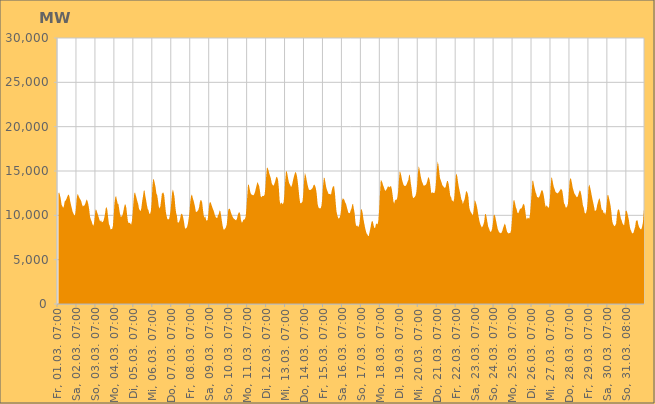
| Category | Series 0 |
|---|---|
|  Fr, 01.03. 07:00  | 12474 |
|  Fr, 01.03. 08:00  | 12588 |
|  Fr, 01.03. 09:00  | 12278 |
|  Fr, 01.03. 10:00  | 11848 |
|  Fr, 01.03. 11:00  | 11210 |
|  Fr, 01.03. 12:00  | 11018 |
|  Fr, 01.03. 13:00  | 10865 |
|  Fr, 01.03. 14:00  | 11047 |
|  Fr, 01.03. 15:00  | 11590 |
|  Fr, 01.03. 16:00  | 11647 |
|  Fr, 01.03. 17:00  | 11807 |
|  Fr, 01.03. 18:00  | 12052 |
|  Fr, 01.03. 19:00  | 12258 |
|  Fr, 01.03. 20:00  | 12343 |
|  Fr, 01.03. 21:00  | 12111 |
|  Fr, 01.03. 22:00  | 11577 |
|  Fr, 01.03. 23:00  | 11164 |
|  Sa, 02.03. 00:00  | 10797 |
|  Sa, 02.03. 01:00  | 10409 |
|  Sa, 02.03. 02:00  | 10225 |
|  Sa, 02.03. 03:00  | 10004 |
|  Sa, 02.03. 04:00  | 10010 |
|  Sa, 02.03. 05:00  | 10599 |
|  Sa, 02.03. 06:00  | 11720 |
|  Sa, 02.03. 07:00  | 12374 |
|  Sa, 02.03. 08:00  | 12331 |
|  Sa, 02.03. 09:00  | 12085 |
|  Sa, 02.03. 10:00  | 11909 |
|  Sa, 02.03. 11:00  | 11770 |
|  Sa, 02.03. 12:00  | 11555 |
|  Sa, 02.03. 13:00  | 11205 |
|  Sa, 02.03. 14:00  | 11000 |
|  Sa, 02.03. 15:00  | 11093 |
|  Sa, 02.03. 16:00  | 11101 |
|  Sa, 02.03. 17:00  | 11313 |
|  Sa, 02.03. 18:00  | 11615 |
|  Sa, 02.03. 19:00  | 11793 |
|  Sa, 02.03. 20:00  | 11565 |
|  Sa, 02.03. 21:00  | 11215 |
|  Sa, 02.03. 22:00  | 10663 |
|  Sa, 02.03. 23:00  | 9869 |
|  So, 03.03. 00:00  | 9539 |
|  So, 03.03. 01:00  | 9340 |
|  So, 03.03. 02:00  | 9037 |
|  So, 03.03. 03:00  | 8820 |
|  So, 03.03. 04:00  | 9035 |
|  So, 03.03. 05:00  | 9807 |
|  So, 03.03. 06:00  | 10649 |
|  So, 03.03. 07:00  | 10633 |
|  So, 03.03. 08:00  | 10366 |
|  So, 03.03. 09:00  | 10088 |
|  So, 03.03. 10:00  | 9784 |
|  So, 03.03. 11:00  | 9491 |
|  So, 03.03. 12:00  | 9295 |
|  So, 03.03. 13:00  | 9470 |
|  So, 03.03. 14:00  | 9209 |
|  So, 03.03. 15:00  | 9255 |
|  So, 03.03. 16:00  | 9367 |
|  So, 03.03. 17:00  | 9700 |
|  So, 03.03. 18:00  | 10154 |
|  So, 03.03. 19:00  | 10827 |
|  So, 03.03. 20:00  | 10927 |
|  So, 03.03. 21:00  | 10557 |
|  So, 03.03. 22:00  | 9726 |
|  So, 03.03. 23:00  | 8995 |
|  Mo, 04.03. 00:00  | 8818 |
|  Mo, 04.03. 01:00  | 8394 |
|  Mo, 04.03. 02:00  | 8450 |
|  Mo, 04.03. 03:00  | 8442 |
|  Mo, 04.03. 04:00  | 8826 |
|  Mo, 04.03. 05:00  | 9967 |
|  Mo, 04.03. 06:00  | 11379 |
|  Mo, 04.03. 07:00  | 12036 |
|  Mo, 04.03. 08:00  | 12201 |
|  Mo, 04.03. 09:00  | 11750 |
|  Mo, 04.03. 10:00  | 11328 |
|  Mo, 04.03. 11:00  | 11286 |
|  Mo, 04.03. 12:00  | 10682 |
|  Mo, 04.03. 13:00  | 10157 |
|  Mo, 04.03. 14:00  | 9817 |
|  Mo, 04.03. 15:00  | 9871 |
|  Mo, 04.03. 16:00  | 10009 |
|  Mo, 04.03. 17:00  | 10329 |
|  Mo, 04.03. 18:00  | 10817 |
|  Mo, 04.03. 19:00  | 11216 |
|  Mo, 04.03. 20:00  | 11229 |
|  Mo, 04.03. 21:00  | 10851 |
|  Mo, 04.03. 22:00  | 10041 |
|  Mo, 04.03. 23:00  | 9333 |
|  Di, 05.03. 00:00  | 9113 |
|  Di, 05.03. 01:00  | 9171 |
|  Di, 05.03. 02:00  | 9086 |
|  Di, 05.03. 03:00  | 8950 |
|  Di, 05.03. 04:00  | 9324 |
|  Di, 05.03. 05:00  | 10241 |
|  Di, 05.03. 06:00  | 11439 |
|  Di, 05.03. 07:00  | 12460 |
|  Di, 05.03. 08:00  | 12591 |
|  Di, 05.03. 09:00  | 12242 |
|  Di, 05.03. 10:00  | 11918 |
|  Di, 05.03. 11:00  | 11565 |
|  Di, 05.03. 12:00  | 11300 |
|  Di, 05.03. 13:00  | 10754 |
|  Di, 05.03. 14:00  | 10591 |
|  Di, 05.03. 15:00  | 10469 |
|  Di, 05.03. 16:00  | 10821 |
|  Di, 05.03. 17:00  | 11552 |
|  Di, 05.03. 18:00  | 12109 |
|  Di, 05.03. 19:00  | 12754 |
|  Di, 05.03. 20:00  | 12836 |
|  Di, 05.03. 21:00  | 12213 |
|  Di, 05.03. 22:00  | 11735 |
|  Di, 05.03. 23:00  | 11202 |
|  Mi, 06.03. 00:00  | 10736 |
|  Mi, 06.03. 01:00  | 10596 |
|  Mi, 06.03. 02:00  | 10188 |
|  Mi, 06.03. 03:00  | 10158 |
|  Mi, 06.03. 04:00  | 10442 |
|  Mi, 06.03. 05:00  | 11448 |
|  Mi, 06.03. 06:00  | 13250 |
|  Mi, 06.03. 07:00  | 14131 |
|  Mi, 06.03. 08:00  | 14007 |
|  Mi, 06.03. 09:00  | 13616 |
|  Mi, 06.03. 10:00  | 13184 |
|  Mi, 06.03. 11:00  | 12484 |
|  Mi, 06.03. 12:00  | 12289 |
|  Mi, 06.03. 13:00  | 11728 |
|  Mi, 06.03. 14:00  | 11034 |
|  Mi, 06.03. 15:00  | 10759 |
|  Mi, 06.03. 16:00  | 11009 |
|  Mi, 06.03. 17:00  | 11661 |
|  Mi, 06.03. 18:00  | 12433 |
|  Mi, 06.03. 19:00  | 12543 |
|  Mi, 06.03. 20:00  | 12572 |
|  Mi, 06.03. 21:00  | 12222 |
|  Mi, 06.03. 22:00  | 11279 |
|  Mi, 06.03. 23:00  | 10389 |
|  Do, 07.03. 00:00  | 9917 |
|  Do, 07.03. 01:00  | 9564 |
|  Do, 07.03. 02:00  | 9549 |
|  Do, 07.03. 03:00  | 9561 |
|  Do, 07.03. 04:00  | 9956 |
|  Do, 07.03. 05:00  | 10587 |
|  Do, 07.03. 06:00  | 11574 |
|  Do, 07.03. 07:00  | 12618 |
|  Do, 07.03. 08:00  | 12909 |
|  Do, 07.03. 09:00  | 12537 |
|  Do, 07.03. 10:00  | 12048 |
|  Do, 07.03. 11:00  | 10982 |
|  Do, 07.03. 12:00  | 10286 |
|  Do, 07.03. 13:00  | 9961 |
|  Do, 07.03. 14:00  | 9202 |
|  Do, 07.03. 15:00  | 9158 |
|  Do, 07.03. 16:00  | 9317 |
|  Do, 07.03. 17:00  | 9592 |
|  Do, 07.03. 18:00  | 10062 |
|  Do, 07.03. 19:00  | 10199 |
|  Do, 07.03. 20:00  | 10077 |
|  Do, 07.03. 21:00  | 9756 |
|  Do, 07.03. 22:00  | 9264 |
|  Do, 07.03. 23:00  | 8646 |
|  Fr, 08.03. 00:00  | 8466 |
|  Fr, 08.03. 01:00  | 8565 |
|  Fr, 08.03. 02:00  | 8714 |
|  Fr, 08.03. 03:00  | 9104 |
|  Fr, 08.03. 04:00  | 9696 |
|  Fr, 08.03. 05:00  | 10491 |
|  Fr, 08.03. 06:00  | 11575 |
|  Fr, 08.03. 07:00  | 12190 |
|  Fr, 08.03. 08:00  | 12358 |
|  Fr, 08.03. 09:00  | 11987 |
|  Fr, 08.03. 10:00  | 11693 |
|  Fr, 08.03. 11:00  | 11343 |
|  Fr, 08.03. 12:00  | 10907 |
|  Fr, 08.03. 13:00  | 10402 |
|  Fr, 08.03. 14:00  | 10389 |
|  Fr, 08.03. 15:00  | 10480 |
|  Fr, 08.03. 16:00  | 10586 |
|  Fr, 08.03. 17:00  | 10871 |
|  Fr, 08.03. 18:00  | 11435 |
|  Fr, 08.03. 19:00  | 11743 |
|  Fr, 08.03. 20:00  | 11698 |
|  Fr, 08.03. 21:00  | 11434 |
|  Fr, 08.03. 22:00  | 10619 |
|  Fr, 08.03. 23:00  | 9959 |
|  Sa, 09.03. 00:00  | 9734 |
|  Sa, 09.03. 01:00  | 9863 |
|  Sa, 09.03. 02:00  | 9474 |
|  Sa, 09.03. 03:00  | 9385 |
|  Sa, 09.03. 04:00  | 9526 |
|  Sa, 09.03. 05:00  | 10332 |
|  Sa, 09.03. 06:00  | 11295 |
|  Sa, 09.03. 07:00  | 11522 |
|  Sa, 09.03. 08:00  | 11406 |
|  Sa, 09.03. 09:00  | 11113 |
|  Sa, 09.03. 10:00  | 10850 |
|  Sa, 09.03. 11:00  | 10638 |
|  Sa, 09.03. 12:00  | 10383 |
|  Sa, 09.03. 13:00  | 10045 |
|  Sa, 09.03. 14:00  | 9830 |
|  Sa, 09.03. 15:00  | 9734 |
|  Sa, 09.03. 16:00  | 9692 |
|  Sa, 09.03. 17:00  | 10002 |
|  Sa, 09.03. 18:00  | 10145 |
|  Sa, 09.03. 19:00  | 10536 |
|  Sa, 09.03. 20:00  | 10481 |
|  Sa, 09.03. 21:00  | 9923 |
|  Sa, 09.03. 22:00  | 9314 |
|  Sa, 09.03. 23:00  | 8771 |
|  So, 10.03. 00:00  | 8410 |
|  So, 10.03. 01:00  | 8400 |
|  So, 10.03. 02:00  | 8503 |
|  So, 10.03. 03:00  | 8642 |
|  So, 10.03. 04:00  | 8931 |
|  So, 10.03. 05:00  | 9654 |
|  So, 10.03. 06:00  | 10614 |
|  So, 10.03. 07:00  | 10736 |
|  So, 10.03. 08:00  | 10727 |
|  So, 10.03. 09:00  | 10445 |
|  So, 10.03. 10:00  | 10164 |
|  So, 10.03. 11:00  | 9933 |
|  So, 10.03. 12:00  | 9764 |
|  So, 10.03. 13:00  | 9615 |
|  So, 10.03. 14:00  | 9565 |
|  So, 10.03. 15:00  | 9465 |
|  So, 10.03. 16:00  | 9455 |
|  So, 10.03. 17:00  | 9610 |
|  So, 10.03. 18:00  | 10009 |
|  So, 10.03. 19:00  | 10285 |
|  So, 10.03. 20:00  | 10373 |
|  So, 10.03. 21:00  | 10180 |
|  So, 10.03. 22:00  | 9527 |
|  So, 10.03. 23:00  | 9192 |
|  Mo, 11.03. 00:00  | 9229 |
|  Mo, 11.03. 01:00  | 9491 |
|  Mo, 11.03. 02:00  | 9509 |
|  Mo, 11.03. 03:00  | 9581 |
|  Mo, 11.03. 04:00  | 9849 |
|  Mo, 11.03. 05:00  | 10795 |
|  Mo, 11.03. 06:00  | 12080 |
|  Mo, 11.03. 07:00  | 13445 |
|  Mo, 11.03. 08:00  | 13476 |
|  Mo, 11.03. 09:00  | 13023 |
|  Mo, 11.03. 10:00  | 12595 |
|  Mo, 11.03. 11:00  | 12364 |
|  Mo, 11.03. 12:00  | 12342 |
|  Mo, 11.03. 13:00  | 12275 |
|  Mo, 11.03. 14:00  | 12276 |
|  Mo, 11.03. 15:00  | 12404 |
|  Mo, 11.03. 16:00  | 12668 |
|  Mo, 11.03. 17:00  | 13078 |
|  Mo, 11.03. 18:00  | 13417 |
|  Mo, 11.03. 19:00  | 13770 |
|  Mo, 11.03. 20:00  | 13541 |
|  Mo, 11.03. 21:00  | 13348 |
|  Mo, 11.03. 22:00  | 12824 |
|  Mo, 11.03. 23:00  | 12159 |
|  Di, 12.03. 00:00  | 12028 |
|  Di, 12.03. 01:00  | 12175 |
|  Di, 12.03. 02:00  | 12201 |
|  Di, 12.03. 03:00  | 12161 |
|  Di, 12.03. 04:00  | 12347 |
|  Di, 12.03. 05:00  | 13119 |
|  Di, 12.03. 06:00  | 14390 |
|  Di, 12.03. 07:00  | 15411 |
|  Di, 12.03. 08:00  | 15333 |
|  Di, 12.03. 09:00  | 15072 |
|  Di, 12.03. 10:00  | 14700 |
|  Di, 12.03. 11:00  | 14423 |
|  Di, 12.03. 12:00  | 14127 |
|  Di, 12.03. 13:00  | 13640 |
|  Di, 12.03. 14:00  | 13441 |
|  Di, 12.03. 15:00  | 13336 |
|  Di, 12.03. 16:00  | 13452 |
|  Di, 12.03. 17:00  | 13712 |
|  Di, 12.03. 18:00  | 14057 |
|  Di, 12.03. 19:00  | 14358 |
|  Di, 12.03. 20:00  | 14291 |
|  Di, 12.03. 21:00  | 14018 |
|  Di, 12.03. 22:00  | 13127 |
|  Di, 12.03. 23:00  | 11710 |
|  Mi, 13.03. 00:00  | 11225 |
|  Mi, 13.03. 01:00  | 11451 |
|  Mi, 13.03. 02:00  | 11354 |
|  Mi, 13.03. 03:00  | 11244 |
|  Mi, 13.03. 04:00  | 11422 |
|  Mi, 13.03. 05:00  | 12276 |
|  Mi, 13.03. 06:00  | 13773 |
|  Mi, 13.03. 07:00  | 14905 |
|  Mi, 13.03. 08:00  | 14998 |
|  Mi, 13.03. 09:00  | 14563 |
|  Mi, 13.03. 10:00  | 14048 |
|  Mi, 13.03. 11:00  | 13669 |
|  Mi, 13.03. 12:00  | 13487 |
|  Mi, 13.03. 13:00  | 13277 |
|  Mi, 13.03. 14:00  | 13211 |
|  Mi, 13.03. 15:00  | 13529 |
|  Mi, 13.03. 16:00  | 13969 |
|  Mi, 13.03. 17:00  | 14341 |
|  Mi, 13.03. 18:00  | 14658 |
|  Mi, 13.03. 19:00  | 14904 |
|  Mi, 13.03. 20:00  | 14765 |
|  Mi, 13.03. 21:00  | 14402 |
|  Mi, 13.03. 22:00  | 13797 |
|  Mi, 13.03. 23:00  | 12966 |
|  Do, 14.03. 00:00  | 12030 |
|  Do, 14.03. 01:00  | 11409 |
|  Do, 14.03. 02:00  | 11354 |
|  Do, 14.03. 03:00  | 11444 |
|  Do, 14.03. 04:00  | 11561 |
|  Do, 14.03. 05:00  | 12450 |
|  Do, 14.03. 06:00  | 13891 |
|  Do, 14.03. 07:00  | 14772 |
|  Do, 14.03. 08:00  | 14549 |
|  Do, 14.03. 09:00  | 14091 |
|  Do, 14.03. 10:00  | 13630 |
|  Do, 14.03. 11:00  | 13211 |
|  Do, 14.03. 12:00  | 12918 |
|  Do, 14.03. 13:00  | 12856 |
|  Do, 14.03. 14:00  | 12856 |
|  Do, 14.03. 15:00  | 12921 |
|  Do, 14.03. 16:00  | 13010 |
|  Do, 14.03. 17:00  | 13123 |
|  Do, 14.03. 18:00  | 13410 |
|  Do, 14.03. 19:00  | 13473 |
|  Do, 14.03. 20:00  | 13309 |
|  Do, 14.03. 21:00  | 13008 |
|  Do, 14.03. 22:00  | 12407 |
|  Do, 14.03. 23:00  | 11364 |
|  Fr, 15.03. 00:00  | 10946 |
|  Fr, 15.03. 01:00  | 10788 |
|  Fr, 15.03. 02:00  | 10801 |
|  Fr, 15.03. 03:00  | 10784 |
|  Fr, 15.03. 04:00  | 11090 |
|  Fr, 15.03. 05:00  | 11916 |
|  Fr, 15.03. 06:00  | 13313 |
|  Fr, 15.03. 07:00  | 14249 |
|  Fr, 15.03. 08:00  | 14199 |
|  Fr, 15.03. 09:00  | 13708 |
|  Fr, 15.03. 10:00  | 13168 |
|  Fr, 15.03. 11:00  | 12864 |
|  Fr, 15.03. 12:00  | 12638 |
|  Fr, 15.03. 13:00  | 12417 |
|  Fr, 15.03. 14:00  | 12402 |
|  Fr, 15.03. 15:00  | 12424 |
|  Fr, 15.03. 16:00  | 12304 |
|  Fr, 15.03. 17:00  | 12790 |
|  Fr, 15.03. 18:00  | 13159 |
|  Fr, 15.03. 19:00  | 13296 |
|  Fr, 15.03. 20:00  | 13253 |
|  Fr, 15.03. 21:00  | 12543 |
|  Fr, 15.03. 22:00  | 11426 |
|  Fr, 15.03. 23:00  | 10445 |
|  Sa, 16.03. 00:00  | 10012 |
|  Sa, 16.03. 01:00  | 9732 |
|  Sa, 16.03. 02:00  | 9620 |
|  Sa, 16.03. 03:00  | 9746 |
|  Sa, 16.03. 04:00  | 10057 |
|  Sa, 16.03. 05:00  | 10756 |
|  Sa, 16.03. 06:00  | 11691 |
|  Sa, 16.03. 07:00  | 11928 |
|  Sa, 16.03. 08:00  | 11859 |
|  Sa, 16.03. 09:00  | 11732 |
|  Sa, 16.03. 10:00  | 11453 |
|  Sa, 16.03. 11:00  | 11303 |
|  Sa, 16.03. 12:00  | 10972 |
|  Sa, 16.03. 13:00  | 10632 |
|  Sa, 16.03. 14:00  | 10286 |
|  Sa, 16.03. 15:00  | 10268 |
|  Sa, 16.03. 16:00  | 10246 |
|  Sa, 16.03. 17:00  | 10591 |
|  Sa, 16.03. 18:00  | 10771 |
|  Sa, 16.03. 19:00  | 11243 |
|  Sa, 16.03. 20:00  | 11273 |
|  Sa, 16.03. 21:00  | 10724 |
|  Sa, 16.03. 22:00  | 10223 |
|  Sa, 16.03. 23:00  | 9214 |
|  So, 17.03. 00:00  | 8775 |
|  So, 17.03. 01:00  | 8880 |
|  So, 17.03. 02:00  | 8748 |
|  So, 17.03. 03:00  | 8711 |
|  So, 17.03. 04:00  | 9031 |
|  So, 17.03. 05:00  | 9813 |
|  So, 17.03. 06:00  | 10713 |
|  So, 17.03. 07:00  | 10661 |
|  So, 17.03. 08:00  | 10326 |
|  So, 17.03. 09:00  | 9661 |
|  So, 17.03. 10:00  | 9159 |
|  So, 17.03. 11:00  | 8688 |
|  So, 17.03. 12:00  | 8285 |
|  So, 17.03. 13:00  | 7972 |
|  So, 17.03. 14:00  | 7862 |
|  So, 17.03. 15:00  | 7657 |
|  So, 17.03. 16:00  | 7711 |
|  So, 17.03. 17:00  | 8175 |
|  So, 17.03. 18:00  | 8586 |
|  So, 17.03. 19:00  | 9115 |
|  So, 17.03. 20:00  | 9378 |
|  So, 17.03. 21:00  | 9291 |
|  So, 17.03. 22:00  | 8862 |
|  So, 17.03. 23:00  | 8555 |
|  Mo, 18.03. 00:00  | 8617 |
|  Mo, 18.03. 01:00  | 9037 |
|  Mo, 18.03. 02:00  | 9048 |
|  Mo, 18.03. 03:00  | 8974 |
|  Mo, 18.03. 04:00  | 9414 |
|  Mo, 18.03. 05:00  | 10653 |
|  Mo, 18.03. 06:00  | 12374 |
|  Mo, 18.03. 07:00  | 13952 |
|  Mo, 18.03. 08:00  | 13927 |
|  Mo, 18.03. 09:00  | 13702 |
|  Mo, 18.03. 10:00  | 13399 |
|  Mo, 18.03. 11:00  | 13171 |
|  Mo, 18.03. 12:00  | 12883 |
|  Mo, 18.03. 13:00  | 12742 |
|  Mo, 18.03. 14:00  | 12888 |
|  Mo, 18.03. 15:00  | 13047 |
|  Mo, 18.03. 16:00  | 13251 |
|  Mo, 18.03. 17:00  | 13261 |
|  Mo, 18.03. 18:00  | 13149 |
|  Mo, 18.03. 19:00  | 13259 |
|  Mo, 18.03. 20:00  | 13299 |
|  Mo, 18.03. 21:00  | 12972 |
|  Mo, 18.03. 22:00  | 12333 |
|  Mo, 18.03. 23:00  | 11602 |
|  Di, 19.03. 00:00  | 11314 |
|  Di, 19.03. 01:00  | 11694 |
|  Di, 19.03. 02:00  | 11764 |
|  Di, 19.03. 03:00  | 11743 |
|  Di, 19.03. 04:00  | 11991 |
|  Di, 19.03. 05:00  | 12657 |
|  Di, 19.03. 06:00  | 13931 |
|  Di, 19.03. 07:00  | 14965 |
|  Di, 19.03. 08:00  | 14855 |
|  Di, 19.03. 09:00  | 14474 |
|  Di, 19.03. 10:00  | 14026 |
|  Di, 19.03. 11:00  | 13673 |
|  Di, 19.03. 12:00  | 13408 |
|  Di, 19.03. 13:00  | 13318 |
|  Di, 19.03. 14:00  | 13299 |
|  Di, 19.03. 15:00  | 13378 |
|  Di, 19.03. 16:00  | 13548 |
|  Di, 19.03. 17:00  | 13785 |
|  Di, 19.03. 18:00  | 13987 |
|  Di, 19.03. 19:00  | 14600 |
|  Di, 19.03. 20:00  | 14479 |
|  Di, 19.03. 21:00  | 13661 |
|  Di, 19.03. 22:00  | 13079 |
|  Di, 19.03. 23:00  | 12252 |
|  Mi, 20.03. 00:00  | 11958 |
|  Mi, 20.03. 01:00  | 11988 |
|  Mi, 20.03. 02:00  | 12068 |
|  Mi, 20.03. 03:00  | 12208 |
|  Mi, 20.03. 04:00  | 12530 |
|  Mi, 20.03. 05:00  | 13368 |
|  Mi, 20.03. 06:00  | 14700 |
|  Mi, 20.03. 07:00  | 15526 |
|  Mi, 20.03. 08:00  | 15285 |
|  Mi, 20.03. 09:00  | 14719 |
|  Mi, 20.03. 10:00  | 14235 |
|  Mi, 20.03. 11:00  | 13854 |
|  Mi, 20.03. 12:00  | 13642 |
|  Mi, 20.03. 13:00  | 13383 |
|  Mi, 20.03. 14:00  | 13360 |
|  Mi, 20.03. 15:00  | 13365 |
|  Mi, 20.03. 16:00  | 13449 |
|  Mi, 20.03. 17:00  | 13593 |
|  Mi, 20.03. 18:00  | 13916 |
|  Mi, 20.03. 19:00  | 14274 |
|  Mi, 20.03. 20:00  | 14258 |
|  Mi, 20.03. 21:00  | 13907 |
|  Mi, 20.03. 22:00  | 13230 |
|  Mi, 20.03. 23:00  | 12479 |
|  Do, 21.03. 00:00  | 12567 |
|  Do, 21.03. 01:00  | 12588 |
|  Do, 21.03. 02:00  | 12502 |
|  Do, 21.03. 03:00  | 12528 |
|  Do, 21.03. 04:00  | 12851 |
|  Do, 21.03. 05:00  | 13802 |
|  Do, 21.03. 06:00  | 15206 |
|  Do, 21.03. 07:00  | 16040 |
|  Do, 21.03. 08:00  | 15757 |
|  Do, 21.03. 09:00  | 14972 |
|  Do, 21.03. 10:00  | 14195 |
|  Do, 21.03. 11:00  | 13968 |
|  Do, 21.03. 12:00  | 13689 |
|  Do, 21.03. 13:00  | 13410 |
|  Do, 21.03. 14:00  | 13305 |
|  Do, 21.03. 15:00  | 13152 |
|  Do, 21.03. 16:00  | 13109 |
|  Do, 21.03. 17:00  | 13143 |
|  Do, 21.03. 18:00  | 13554 |
|  Do, 21.03. 19:00  | 13869 |
|  Do, 21.03. 20:00  | 13881 |
|  Do, 21.03. 21:00  | 13512 |
|  Do, 21.03. 22:00  | 12879 |
|  Do, 21.03. 23:00  | 12174 |
|  Fr, 22.03. 00:00  | 12072 |
|  Fr, 22.03. 01:00  | 11702 |
|  Fr, 22.03. 02:00  | 11650 |
|  Fr, 22.03. 03:00  | 11521 |
|  Fr, 22.03. 04:00  | 11903 |
|  Fr, 22.03. 05:00  | 13008 |
|  Fr, 22.03. 06:00  | 14463 |
|  Fr, 22.03. 07:00  | 14729 |
|  Fr, 22.03. 08:00  | 14306 |
|  Fr, 22.03. 09:00  | 13648 |
|  Fr, 22.03. 10:00  | 13134 |
|  Fr, 22.03. 11:00  | 12707 |
|  Fr, 22.03. 12:00  | 12290 |
|  Fr, 22.03. 13:00  | 11805 |
|  Fr, 22.03. 14:00  | 11651 |
|  Fr, 22.03. 15:00  | 11267 |
|  Fr, 22.03. 16:00  | 11572 |
|  Fr, 22.03. 17:00  | 11752 |
|  Fr, 22.03. 18:00  | 12216 |
|  Fr, 22.03. 19:00  | 12710 |
|  Fr, 22.03. 20:00  | 12693 |
|  Fr, 22.03. 21:00  | 12482 |
|  Fr, 22.03. 22:00  | 12045 |
|  Fr, 22.03. 23:00  | 10941 |
|  Sa, 23.03. 00:00  | 10578 |
|  Sa, 23.03. 01:00  | 10353 |
|  Sa, 23.03. 02:00  | 10243 |
|  Sa, 23.03. 03:00  | 10019 |
|  Sa, 23.03. 04:00  | 10173 |
|  Sa, 23.03. 05:00  | 10870 |
|  Sa, 23.03. 06:00  | 11747 |
|  Sa, 23.03. 07:00  | 11552 |
|  Sa, 23.03. 08:00  | 11272 |
|  Sa, 23.03. 09:00  | 10894 |
|  Sa, 23.03. 10:00  | 10339 |
|  Sa, 23.03. 11:00  | 9805 |
|  Sa, 23.03. 12:00  | 9326 |
|  Sa, 23.03. 13:00  | 9019 |
|  Sa, 23.03. 14:00  | 8804 |
|  Sa, 23.03. 15:00  | 8623 |
|  Sa, 23.03. 16:00  | 8777 |
|  Sa, 23.03. 17:00  | 8970 |
|  Sa, 23.03. 18:00  | 9309 |
|  Sa, 23.03. 19:00  | 10123 |
|  Sa, 23.03. 20:00  | 10171 |
|  Sa, 23.03. 21:00  | 9777 |
|  Sa, 23.03. 22:00  | 9256 |
|  Sa, 23.03. 23:00  | 8735 |
|  So, 24.03. 00:00  | 8527 |
|  So, 24.03. 01:00  | 8269 |
|  So, 24.03. 02:00  | 8121 |
|  So, 24.03. 03:00  | 8210 |
|  So, 24.03. 04:00  | 8479 |
|  So, 24.03. 05:00  | 9144 |
|  So, 24.03. 06:00  | 10035 |
|  So, 24.03. 07:00  | 10068 |
|  So, 24.03. 08:00  | 9844 |
|  So, 24.03. 09:00  | 9400 |
|  So, 24.03. 10:00  | 8929 |
|  So, 24.03. 11:00  | 8486 |
|  So, 24.03. 12:00  | 8256 |
|  So, 24.03. 13:00  | 8075 |
|  So, 24.03. 14:00  | 8039 |
|  So, 24.03. 15:00  | 7977 |
|  So, 24.03. 16:00  | 8072 |
|  So, 24.03. 17:00  | 8258 |
|  So, 24.03. 18:00  | 8610 |
|  So, 24.03. 19:00  | 8861 |
|  So, 24.03. 20:00  | 9076 |
|  So, 24.03. 21:00  | 8879 |
|  So, 24.03. 22:00  | 8469 |
|  So, 24.03. 23:00  | 8103 |
|  Mo, 25.03. 00:00  | 8030 |
|  Mo, 25.03. 01:00  | 7938 |
|  Mo, 25.03. 02:00  | 8023 |
|  Mo, 25.03. 03:00  | 8004 |
|  Mo, 25.03. 04:00  | 8322 |
|  Mo, 25.03. 05:00  | 9356 |
|  Mo, 25.03. 06:00  | 10565 |
|  Mo, 25.03. 07:00  | 11658 |
|  Mo, 25.03. 08:00  | 11734 |
|  Mo, 25.03. 09:00  | 11381 |
|  Mo, 25.03. 10:00  | 10919 |
|  Mo, 25.03. 11:00  | 10691 |
|  Mo, 25.03. 12:00  | 10296 |
|  Mo, 25.03. 13:00  | 10229 |
|  Mo, 25.03. 14:00  | 10420 |
|  Mo, 25.03. 15:00  | 10664 |
|  Mo, 25.03. 16:00  | 10764 |
|  Mo, 25.03. 17:00  | 10770 |
|  Mo, 25.03. 18:00  | 10951 |
|  Mo, 25.03. 19:00  | 11206 |
|  Mo, 25.03. 20:00  | 11305 |
|  Mo, 25.03. 21:00  | 11113 |
|  Mo, 25.03. 22:00  | 10455 |
|  Mo, 25.03. 23:00  | 9763 |
|  Di, 26.03. 00:00  | 9528 |
|  Di, 26.03. 01:00  | 9742 |
|  Di, 26.03. 02:00  | 9702 |
|  Di, 26.03. 03:00  | 9602 |
|  Di, 26.03. 04:00  | 10174 |
|  Di, 26.03. 05:00  | 11305 |
|  Di, 26.03. 06:00  | 12540 |
|  Di, 26.03. 07:00  | 13904 |
|  Di, 26.03. 08:00  | 13885 |
|  Di, 26.03. 09:00  | 13393 |
|  Di, 26.03. 10:00  | 13008 |
|  Di, 26.03. 11:00  | 12618 |
|  Di, 26.03. 12:00  | 12374 |
|  Di, 26.03. 13:00  | 12023 |
|  Di, 26.03. 14:00  | 12075 |
|  Di, 26.03. 15:00  | 11964 |
|  Di, 26.03. 16:00  | 12157 |
|  Di, 26.03. 17:00  | 12396 |
|  Di, 26.03. 18:00  | 12708 |
|  Di, 26.03. 19:00  | 12860 |
|  Di, 26.03. 20:00  | 12770 |
|  Di, 26.03. 21:00  | 12414 |
|  Di, 26.03. 22:00  | 11901 |
|  Di, 26.03. 23:00  | 11233 |
|  Mi, 27.03. 00:00  | 10942 |
|  Mi, 27.03. 01:00  | 11139 |
|  Mi, 27.03. 02:00  | 10982 |
|  Mi, 27.03. 03:00  | 10870 |
|  Mi, 27.03. 04:00  | 10897 |
|  Mi, 27.03. 05:00  | 11716 |
|  Mi, 27.03. 06:00  | 13253 |
|  Mi, 27.03. 07:00  | 14295 |
|  Mi, 27.03. 08:00  | 14145 |
|  Mi, 27.03. 09:00  | 13662 |
|  Mi, 27.03. 10:00  | 13204 |
|  Mi, 27.03. 11:00  | 12996 |
|  Mi, 27.03. 12:00  | 12692 |
|  Mi, 27.03. 13:00  | 12551 |
|  Mi, 27.03. 14:00  | 12533 |
|  Mi, 27.03. 15:00  | 12462 |
|  Mi, 27.03. 16:00  | 12585 |
|  Mi, 27.03. 17:00  | 12703 |
|  Mi, 27.03. 18:00  | 12835 |
|  Mi, 27.03. 19:00  | 12991 |
|  Mi, 27.03. 20:00  | 12919 |
|  Mi, 27.03. 21:00  | 12706 |
|  Mi, 27.03. 22:00  | 12053 |
|  Mi, 27.03. 23:00  | 11337 |
|  Do, 28.03. 00:00  | 11241 |
|  Do, 28.03. 01:00  | 10898 |
|  Do, 28.03. 02:00  | 10883 |
|  Do, 28.03. 03:00  | 11011 |
|  Do, 28.03. 04:00  | 11312 |
|  Do, 28.03. 05:00  | 12415 |
|  Do, 28.03. 06:00  | 13793 |
|  Do, 28.03. 07:00  | 14222 |
|  Do, 28.03. 08:00  | 14062 |
|  Do, 28.03. 09:00  | 13645 |
|  Do, 28.03. 10:00  | 13124 |
|  Do, 28.03. 11:00  | 12809 |
|  Do, 28.03. 12:00  | 12476 |
|  Do, 28.03. 13:00  | 12349 |
|  Do, 28.03. 14:00  | 12196 |
|  Do, 28.03. 15:00  | 12048 |
|  Do, 28.03. 16:00  | 12067 |
|  Do, 28.03. 17:00  | 12288 |
|  Do, 28.03. 18:00  | 12616 |
|  Do, 28.03. 19:00  | 12835 |
|  Do, 28.03. 20:00  | 12687 |
|  Do, 28.03. 21:00  | 12288 |
|  Do, 28.03. 22:00  | 11701 |
|  Do, 28.03. 23:00  | 11077 |
|  Fr, 29.03. 00:00  | 10882 |
|  Fr, 29.03. 01:00  | 10323 |
|  Fr, 29.03. 02:00  | 10181 |
|  Fr, 29.03. 03:00  | 10310 |
|  Fr, 29.03. 04:00  | 10714 |
|  Fr, 29.03. 05:00  | 11597 |
|  Fr, 29.03. 06:00  | 13141 |
|  Fr, 29.03. 07:00  | 13496 |
|  Fr, 29.03. 08:00  | 13161 |
|  Fr, 29.03. 09:00  | 12774 |
|  Fr, 29.03. 10:00  | 12255 |
|  Fr, 29.03. 11:00  | 11813 |
|  Fr, 29.03. 12:00  | 11400 |
|  Fr, 29.03. 13:00  | 11001 |
|  Fr, 29.03. 14:00  | 10496 |
|  Fr, 29.03. 15:00  | 10523 |
|  Fr, 29.03. 16:00  | 10670 |
|  Fr, 29.03. 17:00  | 11193 |
|  Fr, 29.03. 18:00  | 11478 |
|  Fr, 29.03. 19:00  | 11801 |
|  Fr, 29.03. 20:00  | 11928 |
|  Fr, 29.03. 21:00  | 11530 |
|  Fr, 29.03. 22:00  | 10953 |
|  Fr, 29.03. 23:00  | 10535 |
|  Sa, 30.03. 00:00  | 10659 |
|  Sa, 30.03. 01:00  | 10258 |
|  Sa, 30.03. 02:00  | 10354 |
|  Sa, 30.03. 03:00  | 10067 |
|  Sa, 30.03. 04:00  | 10371 |
|  Sa, 30.03. 05:00  | 11186 |
|  Sa, 30.03. 06:00  | 12282 |
|  Sa, 30.03. 07:00  | 12286 |
|  Sa, 30.03. 08:00  | 11922 |
|  Sa, 30.03. 09:00  | 11499 |
|  Sa, 30.03. 10:00  | 11026 |
|  Sa, 30.03. 11:00  | 10318 |
|  Sa, 30.03. 12:00  | 9359 |
|  Sa, 30.03. 13:00  | 9032 |
|  Sa, 30.03. 14:00  | 8880 |
|  Sa, 30.03. 15:00  | 8755 |
|  Sa, 30.03. 16:00  | 8883 |
|  Sa, 30.03. 17:00  | 9096 |
|  Sa, 30.03. 18:00  | 10054 |
|  Sa, 30.03. 19:00  | 10585 |
|  Sa, 30.03. 20:00  | 10704 |
|  Sa, 30.03. 21:00  | 10564 |
|  Sa, 30.03. 22:00  | 10078 |
|  Sa, 30.03. 23:00  | 9634 |
|  So, 31.03. 00:00  | 9415 |
|  So, 31.03. 01:00  | 9093 |
|  So, 31.03. 03:00  | 8971 |
|  So, 31.03. 04:00  | 8856 |
|  So, 31.03. 05:00  | 9481 |
|  So, 31.03. 06:00  | 10468 |
|  So, 31.03. 07:00  | 10559 |
|  So, 31.03. 08:00  | 10322 |
|  So, 31.03. 09:00  | 9922 |
|  So, 31.03. 10:00  | 9528 |
|  So, 31.03. 11:00  | 8886 |
|  So, 31.03. 12:00  | 8431 |
|  So, 31.03. 13:00  | 8248 |
|  So, 31.03. 14:00  | 7997 |
|  So, 31.03. 15:00  | 7967 |
|  So, 31.03. 16:00  | 8065 |
|  So, 31.03. 17:00  | 8399 |
|  So, 31.03. 18:00  | 8681 |
|  So, 31.03. 19:00  | 9347 |
|  So, 31.03. 20:00  | 9436 |
|  So, 31.03. 21:00  | 9438 |
|  So, 31.03. 22:00  | 8967 |
|  So, 31.03. 23:00  | 8693 |
|  Mo, 01.04. 00:00  | 8534 |
|  Mo, 01.04. 01:00  | 8414 |
|  Mo, 01.04. 02:00  | 8460 |
|  Mo, 01.04. 03:00  | 8778 |
|  Mo, 01.04. 04:00  | 9277 |
|  Mo, 01.04. 05:00  | 10500 |
|  Sa, 00.  | 11246 |